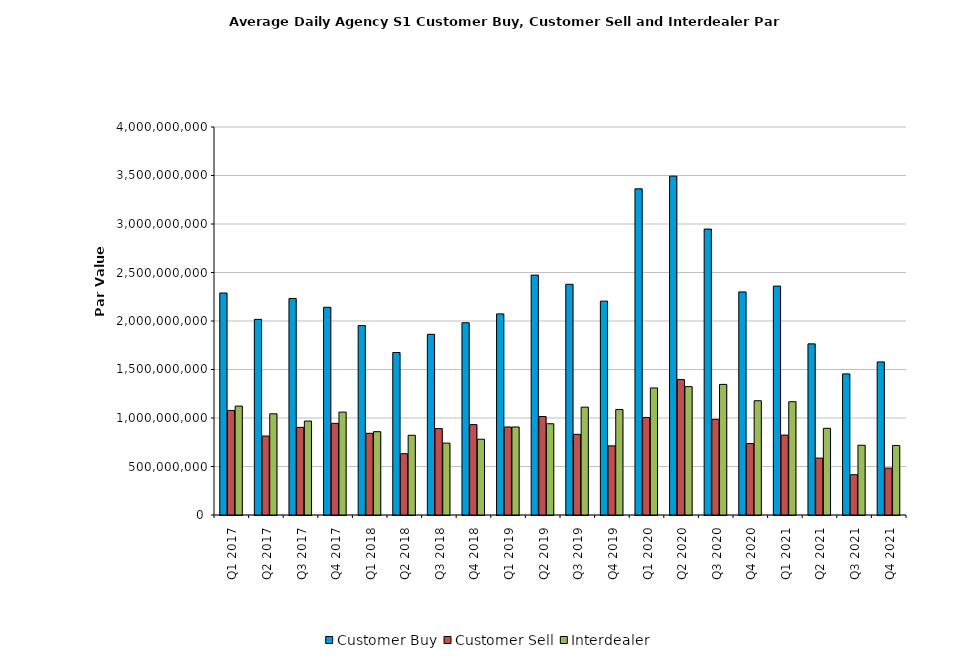
| Category | Customer Buy | Customer Sell | Interdealer |
|---|---|---|---|
| Q1 2017 | 2288549096.546 | 1078026778.301 | 1122683290.019 |
| Q2 2017 | 2016854071.308 | 813934660.294 | 1043002274.748 |
| Q3 2017 | 2232465339.305 | 903380763.894 | 968337710.99 |
| Q4 2017 | 2141415256.413 | 944944928.291 | 1060535846.087 |
| Q1 2018 | 1953070289.161 | 842225728.237 | 858924653.267 |
| Q2 2018 | 1675130757.897 | 631829280.343 | 822052220.44 |
| Q3 2018 | 1862749665.292 | 890746088.764 | 740998328.027 |
| Q4 2018 | 1981793898.347 | 931891609.234 | 780997176.341 |
| Q1 2019 | 2073261289.88 | 907510641.636 | 907260794.476 |
| Q2 2019 | 2473016544.594 | 1015360883.633 | 940855570.046 |
| Q3 2019 | 2378240723.661 | 831622963.177 | 1111864355.118 |
| Q4 2019 | 2204844278.563 | 712918478.978 | 1086841151.009 |
| Q1 2020 | 3362551755.186 | 1004751117.532 | 1309827535.649 |
| Q2 2020 | 3493551277.386 | 1395918416.507 | 1323386792.52 |
| Q3 2020 | 2947577049.279 | 986470577.23 | 1346329562.976 |
| Q4 2020 | 2299861782.395 | 736719021.503 | 1177913333.868 |
| Q1 2021 | 2359997883.405 | 823688579.746 | 1167873739.582 |
| Q2 2021 | 1764193861.289 | 586671797.083 | 893791433.931 |
| Q3 2021 | 1454835444.617 | 415056304.899 | 719075537.285 |
| Q4 2021 | 1578222361.26 | 483014882.953 | 716584342.958 |